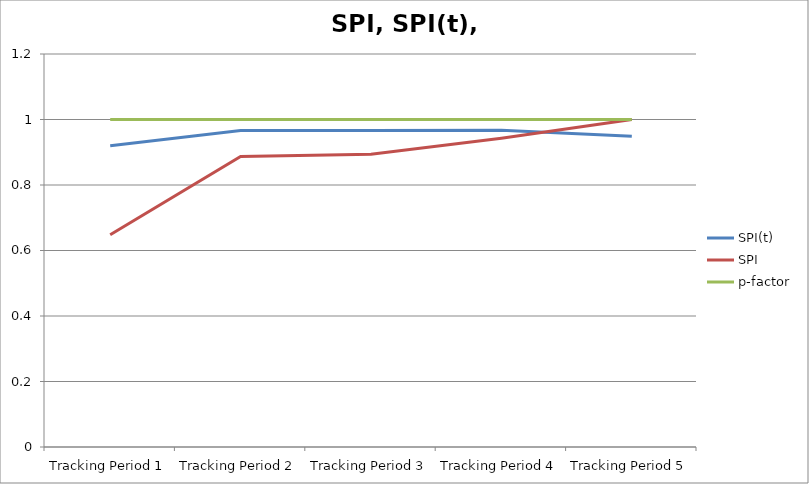
| Category | SPI(t) | SPI | p-factor |
|---|---|---|---|
| Tracking Period 1 | 0.92 | 0.648 | 1 |
| Tracking Period 2 | 0.966 | 0.887 | 1 |
| Tracking Period 3 | 0.967 | 0.894 | 1 |
| Tracking Period 4 | 0.967 | 0.943 | 1 |
| Tracking Period 5 | 0.949 | 1 | 1 |